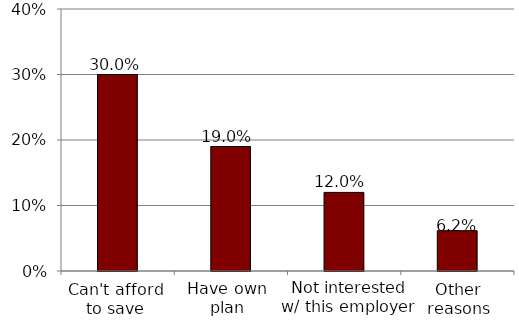
| Category | Series 0 |
|---|---|
| Other | 0.062 |
| I'm not interested in contributing through this employer | 0.12 |
| I have my own retirement plan  | 0.19 |
| I can't afford to save at this time | 0.3 |